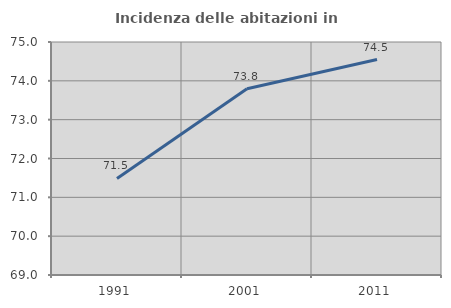
| Category | Incidenza delle abitazioni in proprietà  |
|---|---|
| 1991.0 | 71.487 |
| 2001.0 | 73.796 |
| 2011.0 | 74.548 |